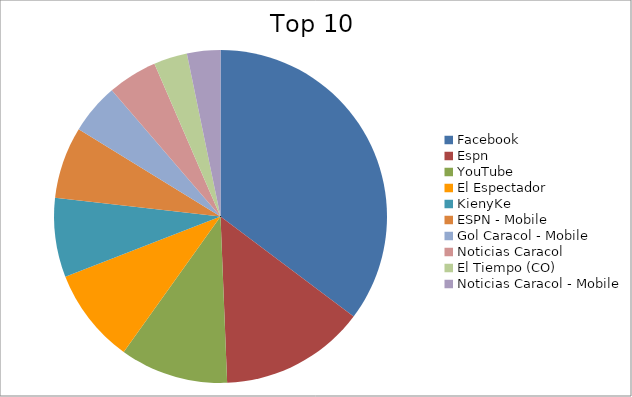
| Category | Series 0 |
|---|---|
| Facebook | 22.74 |
| Espn | 9.1 |
| YouTube | 6.78 |
| El Espectador | 5.95 |
| KienyKe | 4.96 |
| ESPN - Mobile | 4.51 |
| Gol Caracol - Mobile | 3.16 |
| Noticias Caracol | 3.11 |
| El Tiempo (CO) | 2.1 |
| Noticias Caracol - Mobile | 2.09 |